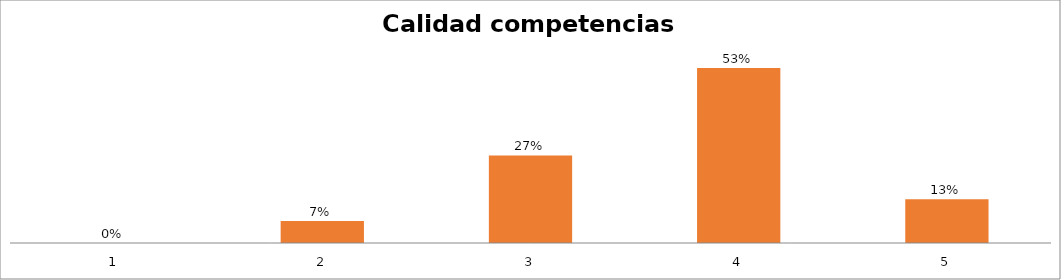
| Category | Series 1 |
|---|---|
| 0 | 0 |
| 1 | 0.067 |
| 2 | 0.267 |
| 3 | 0.533 |
| 4 | 0.133 |